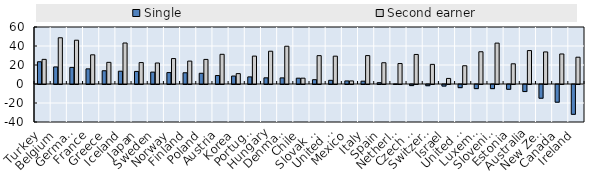
| Category | Single | Second earner |
|---|---|---|
| Turkey | 23.418 | 25.936 |
| Belgium | 17.971 | 48.666 |
| Germany | 17.471 | 46.072 |
| France | 15.93 | 30.723 |
| Greece | 13.941 | 22.782 |
| Iceland | 13.483 | 43.147 |
| Japan | 13.256 | 22.552 |
| Sweden | 12.532 | 22.096 |
| Norway | 12.015 | 26.761 |
| Finland | 11.823 | 24.109 |
| Poland | 11.296 | 25.883 |
| Austria | 8.908 | 31.252 |
| Korea | 8.384 | 10.933 |
| Portugal | 7.484 | 29.373 |
| Hungary | 6.495 | 34.5 |
| Denmark | 6.424 | 39.769 |
| Chile | 6.12 | 6.12 |
| Slovak Republic | 4.535 | 29.854 |
| United States | 3.879 | 29.3 |
| Mexico | 3.224 | 3.224 |
| Italy | 2.967 | 29.908 |
| Spain | 1.388 | 22.37 |
| Netherlands | 0.071 | 21.562 |
| Czech Republic | -1.147 | 31.1 |
| Switzerland | -1.279 | 20.667 |
| Israel | -1.637 | 5.869 |
| United Kingdom | -3.308 | 19.207 |
| Luxembourg | -4.337 | 33.937 |
| Slovenia  | -4.357 | 43.036 |
| Estonia | -5.042 | 21.28 |
| Australia | -7.425 | 35.195 |
| New Zealand | -14.443 | 33.763 |
| Canada | -18.622 | 31.611 |
| Ireland | -31.389 | 28.193 |